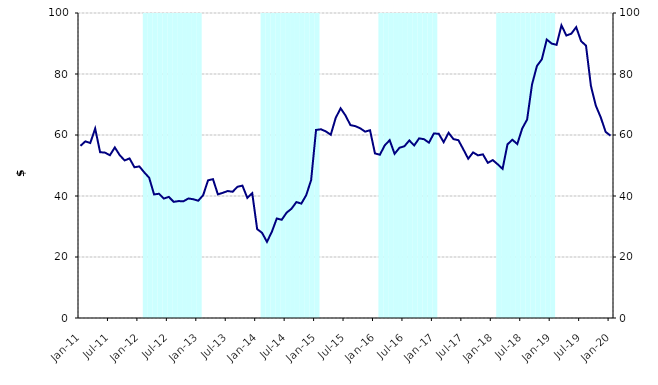
| Category | Series 1 |
|---|---|
| 0 | 0 |
| 1900-01-01 | 0 |
| 1900-01-02 | 0 |
| 1900-01-03 | 0 |
| 1900-01-04 | 0 |
| 1900-01-05 | 0 |
| 1900-01-06 | 0 |
| 1900-01-07 | 0 |
| 1900-01-08 | 0 |
| 1900-01-09 | 0 |
| 1900-01-10 | 0 |
| 1900-01-11 | 0 |
| 1900-01-12 | 0 |
| 1900-01-13 | 160000000 |
| 1900-01-14 | 160000000 |
| 1900-01-15 | 160000000 |
| 1900-01-16 | 160000000 |
| 1900-01-17 | 160000000 |
| 1900-01-18 | 160000000 |
| 1900-01-19 | 160000000 |
| 1900-01-20 | 160000000 |
| 1900-01-21 | 160000000 |
| 1900-01-22 | 160000000 |
| 1900-01-23 | 160000000 |
| 1900-01-24 | 160000000 |
| 1900-01-25 | 0 |
| 1900-01-26 | 0 |
| 1900-01-27 | 0 |
| 1900-01-28 | 0 |
| 1900-01-29 | 0 |
| 1900-01-30 | 0 |
| 1900-01-31 | 0 |
| 1900-02-01 | 0 |
| 1900-02-02 | 0 |
| 1900-02-03 | 0 |
| 1900-02-04 | 0 |
| 1900-02-05 | 0 |
| 1900-02-06 | 160000000 |
| 1900-02-07 | 160000000 |
| 1900-02-08 | 160000000 |
| 1900-02-09 | 160000000 |
| 1900-02-10 | 160000000 |
| 1900-02-11 | 160000000 |
| 1900-02-12 | 160000000 |
| 1900-02-13 | 160000000 |
| 1900-02-14 | 160000000 |
| 1900-02-15 | 160000000 |
| 1900-02-16 | 160000000 |
| 1900-02-17 | 160000000 |
| 1900-02-18 | 0 |
| 1900-02-19 | 0 |
| 1900-02-20 | 0 |
| 1900-02-21 | 0 |
| 1900-02-22 | 0 |
| 1900-02-23 | 0 |
| 1900-02-24 | 0 |
| 1900-02-25 | 0 |
| 1900-02-26 | 0 |
| 1900-02-27 | 0 |
| 1900-02-28 | 0 |
| 1900-02-28 | 0 |
| 1900-03-01 | 160000000 |
| 1900-03-02 | 160000000 |
| 1900-03-03 | 160000000 |
| 1900-03-04 | 160000000 |
| 1900-03-05 | 160000000 |
| 1900-03-06 | 160000000 |
| 1900-03-07 | 160000000 |
| 1900-03-08 | 160000000 |
| 1900-03-09 | 160000000 |
| 1900-03-10 | 160000000 |
| 1900-03-11 | 160000000 |
| 1900-03-12 | 160000000 |
| 1900-03-13 | 0 |
| 1900-03-14 | 0 |
| 1900-03-15 | 0 |
| 1900-03-16 | 0 |
| 1900-03-17 | 0 |
| 1900-03-18 | 0 |
| 1900-03-19 | 0 |
| 1900-03-20 | 0 |
| 1900-03-21 | 0 |
| 1900-03-22 | 0 |
| 1900-03-23 | 0 |
| 1900-03-24 | 0 |
| 1900-03-25 | 160000000 |
| 1900-03-26 | 160000000 |
| 1900-03-27 | 160000000 |
| 1900-03-28 | 160000000 |
| 1900-03-29 | 160000000 |
| 1900-03-30 | 160000000 |
| 1900-03-31 | 160000000 |
| 1900-04-01 | 160000000 |
| 1900-04-02 | 160000000 |
| 1900-04-03 | 160000000 |
| 1900-04-04 | 160000000 |
| 1900-04-05 | 160000000 |
| 1900-04-06 | 0 |
| 1900-04-07 | 0 |
| 1900-04-08 | 0 |
| 1900-04-09 | 0 |
| 1900-04-10 | 0 |
| 1900-04-11 | 0 |
| 1900-04-12 | 0 |
| 1900-04-13 | 0 |
| 1900-04-14 | 0 |
| 1900-04-15 | 0 |
| 1900-04-16 | 0 |
| 1900-04-17 | 0 |